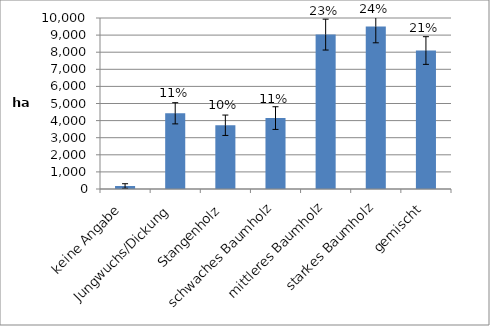
| Category | Kanton Luzern |
|---|---|
| keine Angabe | 175 |
| Jungwuchs/Dickung | 4428 |
| Stangenholz | 3728 |
| schwaches Baumholz | 4147 |
| mittleres Baumholz | 9029 |
| starkes Baumholz | 9499 |
| gemischt | 8098 |